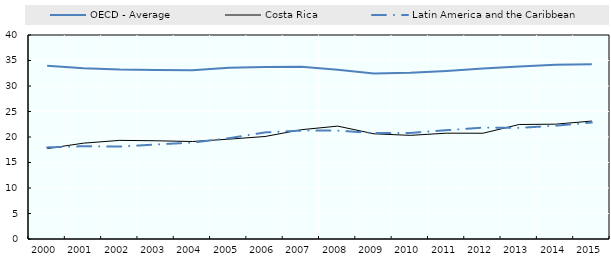
| Category | OECD - Average | Costa Rica | Latin America and the Caribbean |
|---|---|---|---|
| 2000.0 | 33.962 | 17.728 | 17.956 |
| 2001.0 | 33.484 | 18.79 | 18.196 |
| 2002.0 | 33.229 | 19.339 | 18.114 |
| 2003.0 | 33.152 | 19.259 | 18.533 |
| 2004.0 | 33.079 | 19.116 | 18.909 |
| 2005.0 | 33.561 | 19.579 | 19.757 |
| 2006.0 | 33.71 | 20.097 | 20.9 |
| 2007.0 | 33.766 | 21.429 | 21.258 |
| 2008.0 | 33.171 | 22.134 | 21.258 |
| 2009.0 | 32.43 | 20.626 | 20.76 |
| 2010.0 | 32.574 | 20.322 | 20.793 |
| 2011.0 | 32.953 | 20.75 | 21.342 |
| 2012.0 | 33.441 | 20.737 | 21.838 |
| 2013.0 | 33.808 | 22.452 | 21.791 |
| 2014.0 | 34.18 | 22.514 | 22.215 |
| 2015.0 | 34.267 | 23.128 | 22.843 |